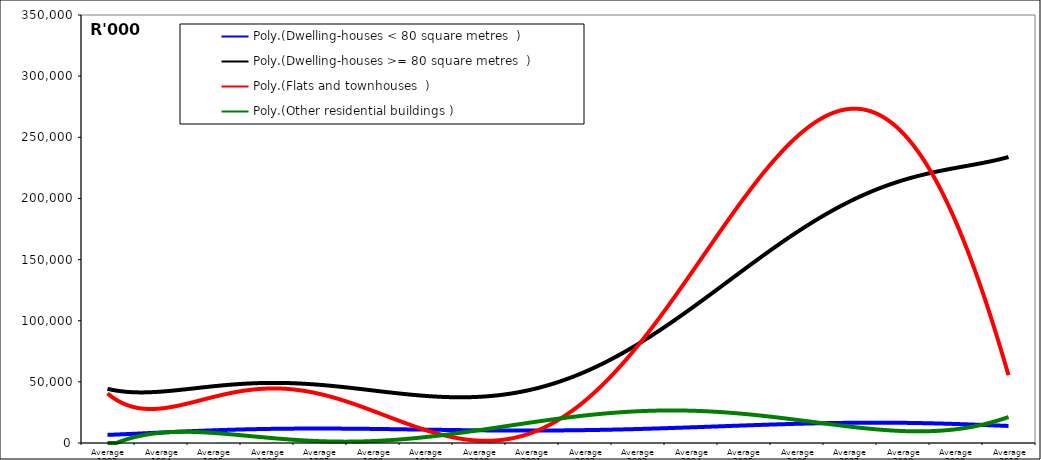
| Category | Dwelling-houses < 80 square metres | Dwelling-houses >= 80 square metres | Flats and townhouses | Other residential buildings |
|---|---|---|---|---|
| Average 1993 | 7002.667 | 42072.5 | 37568.5 | 689.333 |
| Average 1994 | 7902.917 | 43885.417 | 32276.333 | 1638.583 |
| Average 1995 | 9582.167 | 54860.083 | 45983.667 | 616.667 |
| Average 1996 | 13226 | 42982.417 | 33921 | 18173.583 |
| Average 1997 | 11608.667 | 40045.833 | 36993.583 | 4863.167 |
| Average 1998 | 10853.75 | 42286.417 | 21509.583 | 2381.5 |
| Average 1999 | 12713.167 | 38590.333 | 12462.667 | 805.75 |
| Average 2000 | 9060.417 | 48559.333 | 15927 | 2071.25 |
| Average 2001 | 8356.25 | 43928.5 | 17016.917 | 6879.833 |
| Average 2002 | 7887.167 | 59042 | 27388.75 | 41644.167 |
| Average 2003 | 18388.25 | 80922.667 | 68202.333 | 5816.5 |
| Average 2004 | 13124.583 | 102830.333 | 105660.917 | 66929.25 |
| Average 2005 | 11437.083 | 129995.083 | 259275.417 | 2795.5 |
| Average 2006 | 13410.833 | 177164.083 | 225838.583 | 12914.083 |
| Average 2007 | 17393.667 | 202611.167 | 257191.75 | 9037 |
| Average 2008 | 19304.25 | 238379.083 | 287895 | 13261.333 |
| Average 2009 | 13629.75 | 193406.167 | 156058.667 | 18246.917 |
| Average 2010 | 14256.333 | 243891.833 | 62335.167 | 17493.333 |